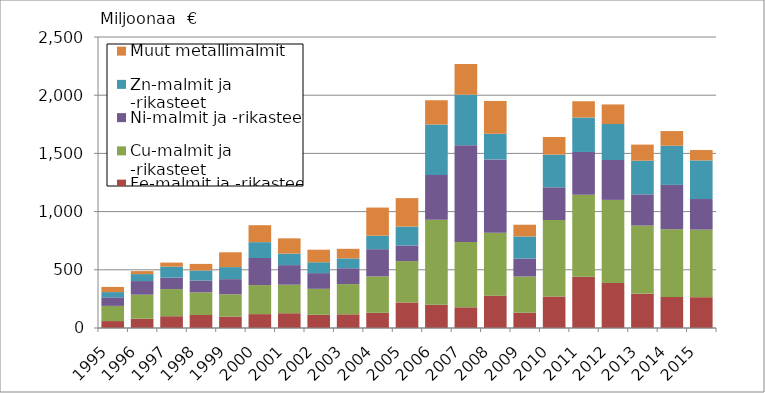
| Category | Fe-malmit ja -rikasteet | Cu-malmit ja -rikasteet | Ni-malmit ja -rikasteet | Zn-malmit ja -rikasteet | Muut metallimalmit |
|---|---|---|---|---|---|
| 1995.0 | 59489 | 130415 | 73508 | 44944 | 44598 |
| 1996.0 | 79860 | 206503 | 116936 | 59525 | 25992 |
| 1997.0 | 101234 | 233159 | 98587 | 94164 | 34979 |
| 1998.0 | 111544 | 194928 | 101754 | 86070 | 56441 |
| 1999.0 | 98240 | 191552 | 129950 | 103397 | 127290 |
| 2000.0 | 119304 | 249218 | 233071 | 135854 | 145736 |
| 2001.0 | 126874 | 245255 | 168125 | 98505 | 131345 |
| 2002.0 | 113455 | 223230 | 134744 | 93407 | 107687 |
| 2003.0 | 117688 | 259557 | 135911 | 84828 | 82226 |
| 2004.0 | 130459 | 313172 | 233547 | 115721 | 241699 |
| 2005.0 | 219439 | 355190 | 134593 | 162035 | 244453 |
| 2006.0 | 199751 | 731232 | 384026 | 433255 | 208475 |
| 2007.0 | 177725 | 561860 | 830577 | 434486 | 263261 |
| 2008.0 | 277823 | 540256 | 630041 | 220619 | 281832 |
| 2009.0 | 131307 | 311283 | 154153 | 189991 | 100405 |
| 2010.0 | 270614.05 | 657398.191 | 280406.513 | 281130.299 | 151763 |
| 2011.0 | 439967 | 704840 | 367501 | 295591 | 140253 |
| 2012.0 | 387423 | 713133 | 342571 | 309618 | 167842 |
| 2013.0 | 293288 | 586889 | 268224 | 288989 | 138131 |
| 2014.0 | 266241 | 581999 | 381451 | 336082 | 126128 |
| 2015.0 | 264774 | 580075 | 263132 | 331894 | 88918 |